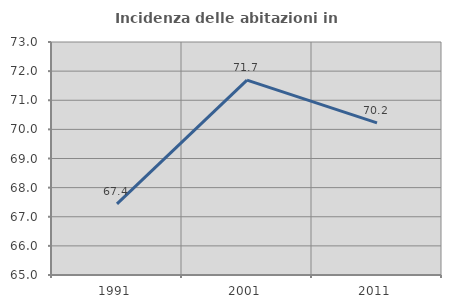
| Category | Incidenza delle abitazioni in proprietà  |
|---|---|
| 1991.0 | 67.439 |
| 2001.0 | 71.689 |
| 2011.0 | 70.222 |